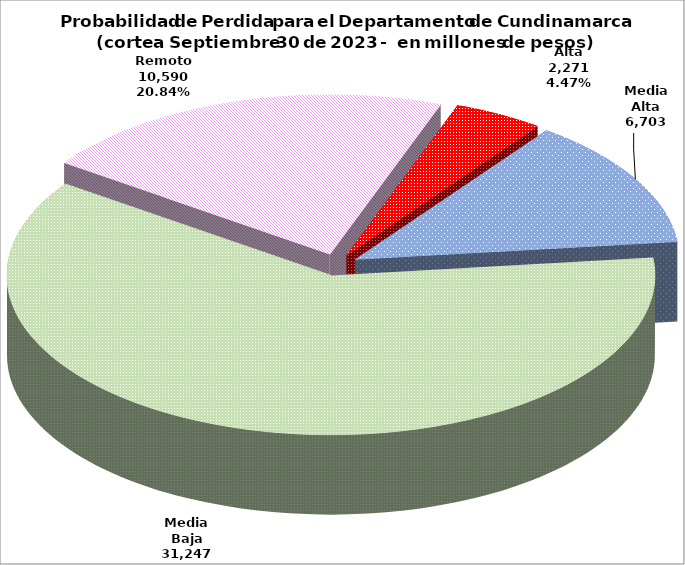
| Category | Series 0 |
|---|---|
| Alta | 2271.358 |
| Media Alta | 6702.829 |
| Media Baja | 31247.216 |
| Remoto | 10589.83 |